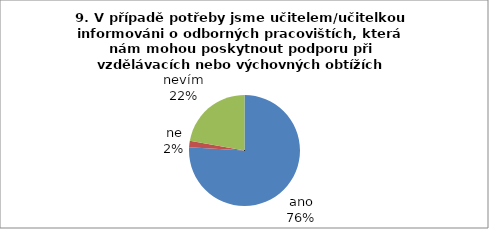
| Category | 9. |
|---|---|
| ano | 41 |
| ne | 1 |
| nevím | 12 |